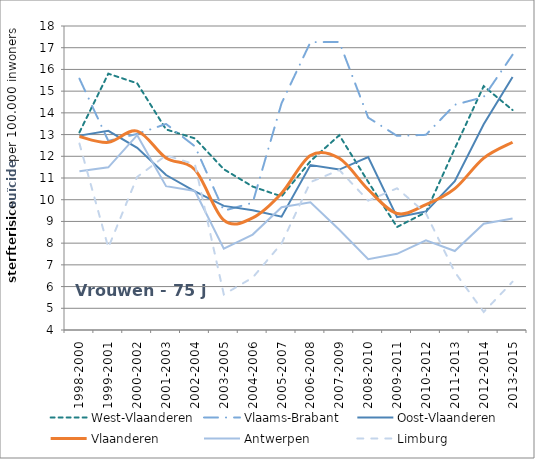
| Category | West-Vlaanderen | Vlaams-Brabant | Oost-Vlaanderen | Vlaanderen | Antwerpen | Limburg |
|---|---|---|---|---|---|---|
| 1998-2000 | 13.101 | 15.576 | 12.951 | 12.911 | 11.312 | 12.586 |
| 1999-2001 | 15.805 | 12.709 | 13.174 | 12.641 | 11.491 | 7.794 |
| 2000-2002 | 15.361 | 13.031 | 12.388 | 13.16 | 12.972 | 11.049 |
| 2001-2003 | 13.237 | 13.488 | 11.137 | 11.921 | 10.625 | 12.042 |
| 2002-2004 | 12.823 | 12.458 | 10.383 | 11.376 | 10.403 | 11.629 |
| 2003-2005 | 11.403 | 9.493 | 9.715 | 9.058 | 7.749 | 5.637 |
| 2004-2006 | 10.605 | 9.861 | 9.513 | 9.167 | 8.395 | 6.412 |
| 2005-2007 | 10.152 | 14.442 | 9.216 | 10.299 | 9.658 | 7.988 |
| 2006-2008 | 11.776 | 17.255 | 11.597 | 12.04 | 9.884 | 10.81 |
| 2007-2009 | 12.971 | 17.265 | 11.389 | 11.909 | 8.618 | 11.367 |
| 2008-2010 | 10.822 | 13.781 | 11.968 | 10.469 | 7.262 | 9.957 |
| 2009-2011 | 8.743 | 12.94 | 9.194 | 9.368 | 7.507 | 10.526 |
| 2010-2012 | 9.424 | 12.988 | 9.452 | 9.773 | 8.132 | 9.369 |
| 2011-2013 | 12.363 | 14.372 | 10.851 | 10.511 | 7.639 | 6.665 |
| 2012-2014 | 15.231 | 14.727 | 13.476 | 11.915 | 8.891 | 4.83 |
| 2013-2015 | 14.128 | 16.675 | 15.656 | 12.647 | 9.136 | 6.223 |